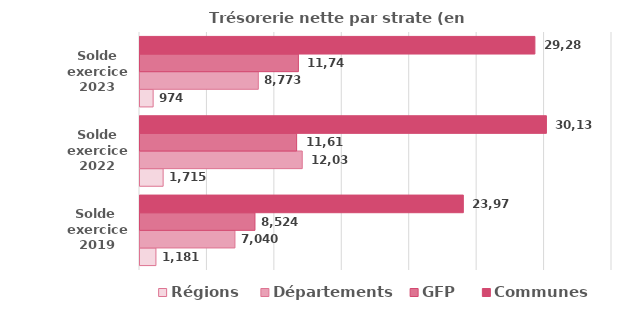
| Category | Régions | Départements | GFP | Communes  |
|---|---|---|---|---|
| Solde 
exercice 2019 | 1180.9 | 7040.2 | 8524.1 | 23976.6 |
| Solde
exercice 2022 | 1715.1 | 12031.2 | 11614.5 | 30137.7 |
| Solde
exercice 2023 | 974.1 | 8772.6 | 11745.5 | 29282.8 |